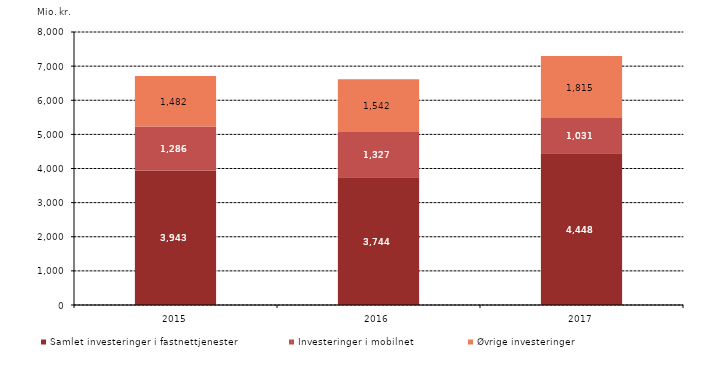
| Category | Samlet investeringer i fastnettjenester | Investeringer i mobilnet | Øvrige investeringer |
|---|---|---|---|
| 2015.0 | 3942.948 | 1286.307 | 1482.137 |
| 2016.0 | 3744.047 | 1326.949 | 1541.516 |
| 2017.0 | 4447.891 | 1030.872 | 1814.789 |